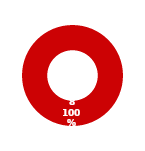
| Category | SITUATION |
|---|---|
| MIL 3 Complete | 0 |
| MIL 3 Not Complete | 8 |